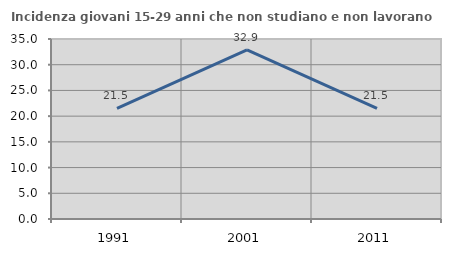
| Category | Incidenza giovani 15-29 anni che non studiano e non lavorano  |
|---|---|
| 1991.0 | 21.492 |
| 2001.0 | 32.877 |
| 2011.0 | 21.528 |